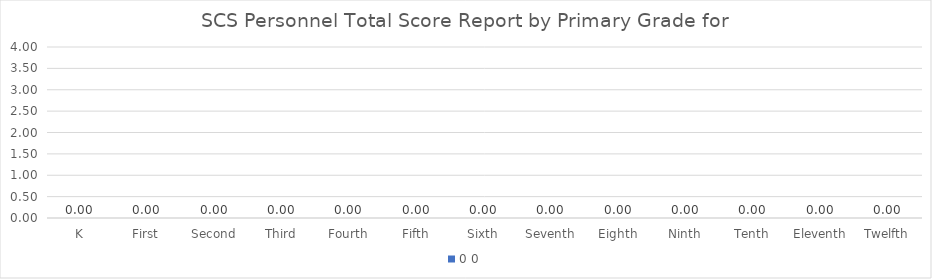
| Category | 0 |
|---|---|
| K | 0 |
| First | 0 |
| Second | 0 |
| Third | 0 |
| Fourth | 0 |
| Fifth | 0 |
| Sixth | 0 |
| Seventh | 0 |
| Eighth | 0 |
| Ninth | 0 |
| Tenth | 0 |
| Eleventh | 0 |
| Twelfth | 0 |